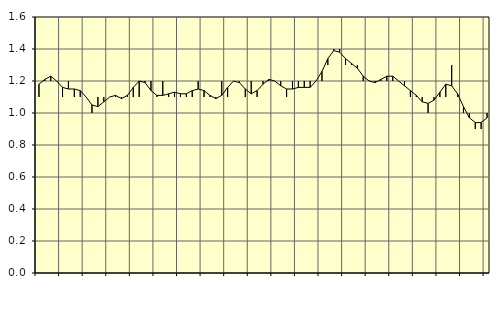
| Category | Piggar | Jordbruk, skogsbruk o fiske, SNI 01-03 |
|---|---|---|
| nan | 1.1 | 1.18 |
| 1.0 | 1.2 | 1.21 |
| 1.0 | 1.2 | 1.23 |
| 1.0 | 1.2 | 1.2 |
| nan | 1.1 | 1.16 |
| 2.0 | 1.2 | 1.15 |
| 2.0 | 1.1 | 1.15 |
| 2.0 | 1.1 | 1.14 |
| nan | 1.1 | 1.1 |
| 3.0 | 1 | 1.05 |
| 3.0 | 1.1 | 1.04 |
| 3.0 | 1.1 | 1.07 |
| nan | 1.1 | 1.1 |
| 4.0 | 1.1 | 1.11 |
| 4.0 | 1.1 | 1.09 |
| 4.0 | 1.1 | 1.11 |
| nan | 1.1 | 1.16 |
| 5.0 | 1.1 | 1.2 |
| 5.0 | 1.2 | 1.19 |
| 5.0 | 1.2 | 1.14 |
| nan | 1.1 | 1.11 |
| 6.0 | 1.2 | 1.11 |
| 6.0 | 1.1 | 1.12 |
| 6.0 | 1.1 | 1.13 |
| nan | 1.1 | 1.12 |
| 7.0 | 1.1 | 1.12 |
| 7.0 | 1.1 | 1.14 |
| 7.0 | 1.2 | 1.15 |
| nan | 1.1 | 1.14 |
| 8.0 | 1.1 | 1.11 |
| 8.0 | 1.1 | 1.09 |
| 8.0 | 1.2 | 1.11 |
| nan | 1.1 | 1.16 |
| 9.0 | 1.2 | 1.2 |
| 9.0 | 1.2 | 1.19 |
| 9.0 | 1.1 | 1.15 |
| nan | 1.2 | 1.12 |
| 10.0 | 1.1 | 1.14 |
| 10.0 | 1.2 | 1.18 |
| 10.0 | 1.2 | 1.21 |
| nan | 1.2 | 1.2 |
| 11.0 | 1.2 | 1.17 |
| 11.0 | 1.1 | 1.15 |
| 11.0 | 1.2 | 1.15 |
| nan | 1.2 | 1.16 |
| 12.0 | 1.2 | 1.16 |
| 12.0 | 1.2 | 1.16 |
| 12.0 | 1.2 | 1.2 |
| nan | 1.2 | 1.26 |
| 13.0 | 1.3 | 1.34 |
| 13.0 | 1.4 | 1.39 |
| 13.0 | 1.4 | 1.38 |
| nan | 1.3 | 1.34 |
| 14.0 | 1.3 | 1.31 |
| 14.0 | 1.3 | 1.28 |
| 14.0 | 1.2 | 1.23 |
| nan | 1.2 | 1.2 |
| 15.0 | 1.2 | 1.19 |
| 15.0 | 1.2 | 1.21 |
| 15.0 | 1.2 | 1.23 |
| nan | 1.2 | 1.23 |
| 16.0 | 1.2 | 1.2 |
| 16.0 | 1.2 | 1.17 |
| 16.0 | 1.1 | 1.14 |
| nan | 1.1 | 1.11 |
| 17.0 | 1.1 | 1.07 |
| 17.0 | 1 | 1.06 |
| 17.0 | 1.1 | 1.08 |
| nan | 1.1 | 1.13 |
| 18.0 | 1.1 | 1.18 |
| 18.0 | 1.3 | 1.17 |
| 18.0 | 1.1 | 1.12 |
| nan | 1 | 1.04 |
| 19.0 | 1 | 0.97 |
| 19.0 | 0.9 | 0.94 |
| 19.0 | 0.9 | 0.94 |
| nan | 1 | 0.97 |